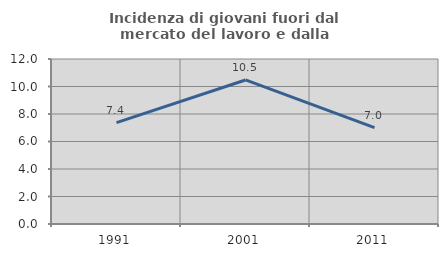
| Category | Incidenza di giovani fuori dal mercato del lavoro e dalla formazione  |
|---|---|
| 1991.0 | 7.368 |
| 2001.0 | 10.476 |
| 2011.0 | 7.006 |